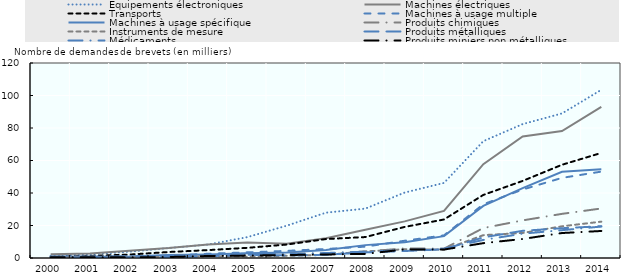
| Category | Équipements électroniques | Machines électriques | Transports | Machines à usage multiple | Machines à usage spécifique | Produits chimiques | Instruments de mesure | Produits métalliques | Médicaments | Produits miniers non métalliques |
|---|---|---|---|---|---|---|---|---|---|---|
| 2000.0 | 1.358 | 2.285 | 0.542 | 0.791 | 0.88 | 0.766 | 0.238 | 0.134 | 0.579 | 0.427 |
| 2001.0 | 2.233 | 2.699 | 1.246 | 0.772 | 0.781 | 0.777 | 0.435 | 0.23 | 0.756 | 0.465 |
| 2002.0 | 3.869 | 4.452 | 2.102 | 0.871 | 0.973 | 0.769 | 0.612 | 0.32 | 1.035 | 0.409 |
| 2003.0 | 6.121 | 6.131 | 3.692 | 1.513 | 1.805 | 1.271 | 0.589 | 0.591 | 1.305 | 0.603 |
| 2004.0 | 8.286 | 8.353 | 4.849 | 2.597 | 2.098 | 1.606 | 1.132 | 1.093 | 1.696 | 1.22 |
| 2005.0 | 12.838 | 9.528 | 6.251 | 3.484 | 2.88 | 2.155 | 0.805 | 2.008 | 2.708 | 1.482 |
| 2006.0 | 19.886 | 8.775 | 8.273 | 4.39 | 3.418 | 2.508 | 1.34 | 1.59 | 2.383 | 1.825 |
| 2007.0 | 27.894 | 12.215 | 11.668 | 5.538 | 4.877 | 2.87 | 1.912 | 1.989 | 3.056 | 2.178 |
| 2008.0 | 30.386 | 17.322 | 12.888 | 6.987 | 7.922 | 3.935 | 4.067 | 3.433 | 3.917 | 2.524 |
| 2009.0 | 40.263 | 22.541 | 19.131 | 10.618 | 9.627 | 5.917 | 5.381 | 4.286 | 4.785 | 5.283 |
| 2010.0 | 46.209 | 28.978 | 23.7 | 13.922 | 13.467 | 5.743 | 5.131 | 5.355 | 5.767 | 5.192 |
| 2011.0 | 71.89 | 57.713 | 38.829 | 33.06 | 32.022 | 18.436 | 14.059 | 12.699 | 11.115 | 9.136 |
| 2012.0 | 82.406 | 74.811 | 47.433 | 42.136 | 43.05 | 23.143 | 15.404 | 16.722 | 14.976 | 11.711 |
| 2013.0 | 88.96 | 78.154 | 57.377 | 49.305 | 53.037 | 27.165 | 19.507 | 18.318 | 17.124 | 15.369 |
| 2014.0 | 103.504 | 92.954 | 64.66 | 53.169 | 54.607 | 30.482 | 22.371 | 19.564 | 19.354 | 16.627 |